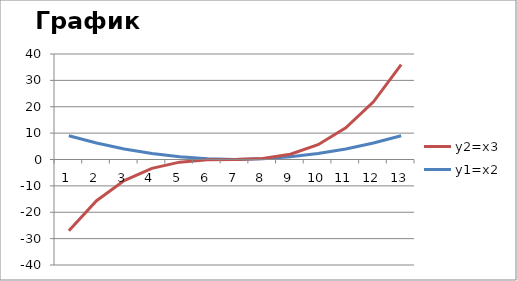
| Category | y1=x2 | y2=x3 |
|---|---|---|
| 0 | 9 | -27 |
| 1 | 6.25 | -15.625 |
| 2 | 4 | -8 |
| 3 | 2.25 | -3.375 |
| 4 | 1 | -1 |
| 5 | 0.25 | -0.125 |
| 6 | 0 | 0 |
| 7 | 0.25 | 0.125 |
| 8 | 1 | 1 |
| 9 | 2.25 | 3.375 |
| 10 | 4 | 8 |
| 11 | 6.25 | 15.625 |
| 12 | 9 | 27 |